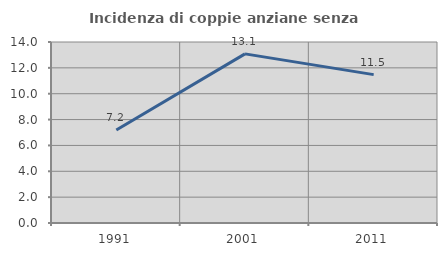
| Category | Incidenza di coppie anziane senza figli  |
|---|---|
| 1991.0 | 7.199 |
| 2001.0 | 13.081 |
| 2011.0 | 11.475 |